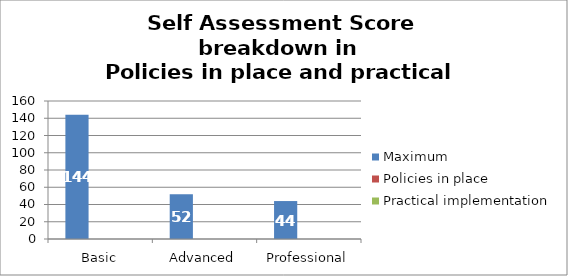
| Category | Maximum | Policies in place | Practical implementation |
|---|---|---|---|
| Basic | 144 | 0 | 0 |
| Advanced | 52 | 0 | 0 |
| Professional | 44 | 0 | 0 |